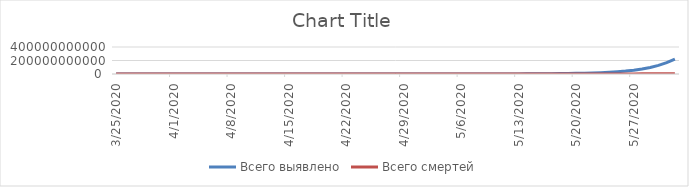
| Category | Всего выявлено | Всего смертей |
|---|---|---|
| 3/25/20 | 460642.66 | 20288.6 |
| 3/26/20 | 510454.679 | 22580.248 |
| 3/27/20 | 567261.017 | 25191.043 |
| 3/28/20 | 632175.872 | 28170.979 |
| 3/29/20 | 706510.551 | 31578.65 |
| 3/30/20 | 791811.301 | 35482.857 |
| 3/31/20 | 889904.94 | 39964.514 |
| 4/1/20 | 1002953.979 | 45118.95 |
| 4/2/20 | 1133523.343 | 51058.67 |
| 4/3/20 | 1284661.27 | 57916.68 |
| 4/4/20 | 1459997.596 | 65850.498 |
| 4/5/20 | 1663863.368 | 75046.994 |
| 4/6/20 | 1901436.701 | 85728.259 |
| 4/7/20 | 2178920.964 | 98158.698 |
| 4/8/20 | 2503762.868 | 112653.659 |
| 4/9/20 | 2884919.902 | 129589.908 |
| 4/10/20 | 3333188.909 | 149418.404 |
| 4/11/20 | 3861610.543 | 172679.867 |
| 4/12/20 | 4485968.089 | 200023.812 |
| 4/13/20 | 5225403.841 | 232231.844 |
| 4/14/20 | 6103182.22 | 270246.212 |
| 4/15/20 | 7147636.384 | 315204.893 |
| 4/16/20 | 8393344.739 | 368484.732 |
| 4/17/20 | 9882596.024 | 431754.618 |
| 4/18/20 | 11667217.331 | 507041.114 |
| 4/19/20 | 13810859.414 | 596809.606 |
| 4/20/20 | 16391859.305 | 704064.819 |
| 4/21/20 | 19506833.137 | 832475.509 |
| 4/22/20 | 23275194.321 | 986529.455 |
| 4/23/20 | 27844846.672 | 1171726.388 |
| 4/24/20 | 33399372.244 | 1394818.608 |
| 4/25/20 | 40167124.343 | 1664111.555 |
| 4/26/20 | 48432753.616 | 1989839.95 |
| 4/27/20 | 58551847.405 | 2384639.293 |
| 4/28/20 | 70969560.461 | 2864137.933 |
| 4/29/20 | 86244372.753 | 3447701.828 |
| 4/30/20 | 105078446.128 | 4159372.999 |
| 5/1/20 | 128356490.674 | 5029054.11 |
| 5/2/20 | 157195626.443 | 6094006.334 |
| 5/3/20 | 193009480.158 | 7400746.653 |
| 5/4/20 | 237590747.224 | 9007455.329 |
| 5/5/20 | 293217753.683 | 10987036.039 |
| 5/6/20 | 362792273.157 | 13431012.464 |
| 5/7/20 | 450018127.292 | 16454498.62 |
| 5/8/20 | 559633108.331 | 20202549.981 |
| 5/9/20 | 697710755.297 | 24858293.221 |
| 5/10/20 | 872053821.828 | 30653350.975 |
| 5/11/20 | 1092708339.548 | 37881233.047 |
| 5/12/20 | 1372636607.123 | 46914568.478 |
| 5/13/20 | 1728600034.195 | 58227319.214 |
| 5/14/20 | 2182319641.381 | 72423466.015 |
| 5/15/20 | 2762004654.406 | 90274117.792 |
| 5/16/20 | 3504370060.242 | 112765602.662 |
| 5/17/20 | 4457304976.462 | 141161900.703 |
| 5/18/20 | 5683408987.717 | 177085838.756 |
| 5/19/20 | 7264688371.078 | 222624872.414 |
| 5/20/20 | 9308805409.774 | 280469144.638 |
| 5/21/20 | 11957411444.996 | 354091988.497 |
| 5/22/20 | 15397281214.859 | 447986341.003 |
| 5/23/20 | 19875220656.118 | 567974935.429 |
| 5/24/20 | 25718067906.196 | 721618017.967 |
| 5/25/20 | 33359582572.49 | 918750200.662 |
| 5/26/20 | 43376669651.051 | 1172188605.802 |
| 5/27/20 | 56538278651.248 | 1498668612.064 |
| 5/28/20 | 73871548435.447 | 1920082548.726 |
| 5/29/20 | 96751463360.871 | 2465122326.903 |
| 5/30/20 | 127022626908.21 | 3171461596.54 |
| 5/31/20 | 167164997151.913 | 4088659781.568 |
| 6/1/20 | 220519917005.962 | 5282033655.087 |